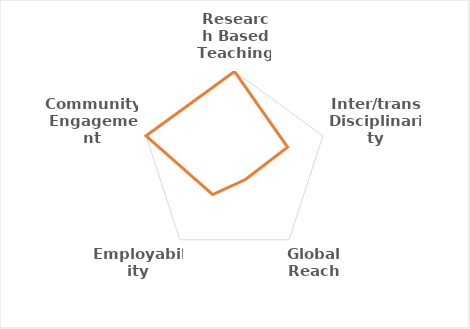
| Category | Series 0 |
|---|---|
| Research Based Teaching | 5 |
| Inter/trans Disciplinarity | 3 |
| Global Reach | 1 |
| Employability | 2 |
| Community Engagement | 5 |